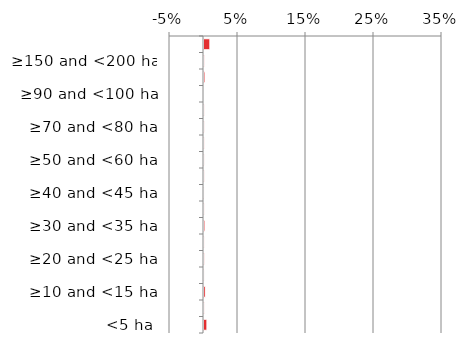
| Category | Near native & fragments |
|---|---|
| <5 ha | 0.004 |
| ≥5 and <10 ha | 0.001 |
| ≥10 and <15 ha | 0.002 |
| ≥15 and <20 ha | 0 |
| ≥20 and <25 ha | 0.001 |
| ≥25 and <30 ha | 0 |
| ≥30 and <35 ha | 0.001 |
| ≥35 and <40 ha | 0 |
| ≥40 and <45 ha | 0 |
| ≥45 and <50 ha | 0 |
| ≥50 and <60 ha | 0 |
| ≥60 and <70 ha | 0 |
| ≥70 and <80 ha | 0 |
| ≥80 and <90 ha | 0 |
| ≥90 and <100 ha | 0 |
| ≥100 and <150 ha | 0.001 |
| ≥150 and <200 ha | 0.001 |
| ≥200 ha | 0.009 |